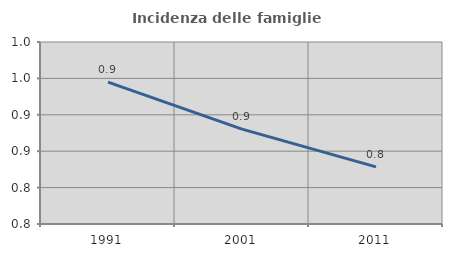
| Category | Incidenza delle famiglie numerose |
|---|---|
| 1991.0 | 0.945 |
| 2001.0 | 0.88 |
| 2011.0 | 0.828 |